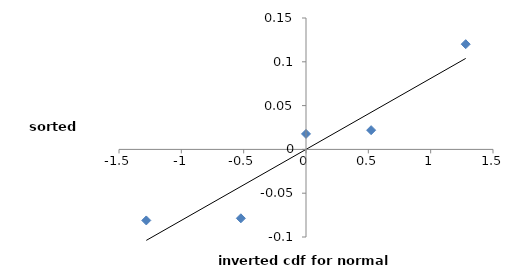
| Category | Series 0 |
|---|---|
| -1.2811261510381207 | -0.081 |
| -0.5224630525257601 | -0.079 |
| 0.0 | 0.018 |
| 0.5224630525257601 | 0.022 |
| 1.281126151038121 | 0.12 |